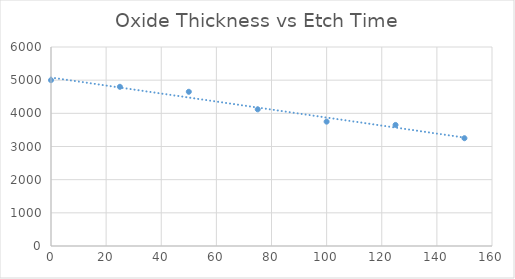
| Category | Series 0 |
|---|---|
| 0.0 | 5000 |
| 25.0 | 4800 |
| 50.0 | 4650 |
| 75.0 | 4120 |
| 100.0 | 3750 |
| 125.0 | 3650 |
| 150.0 | 3250 |